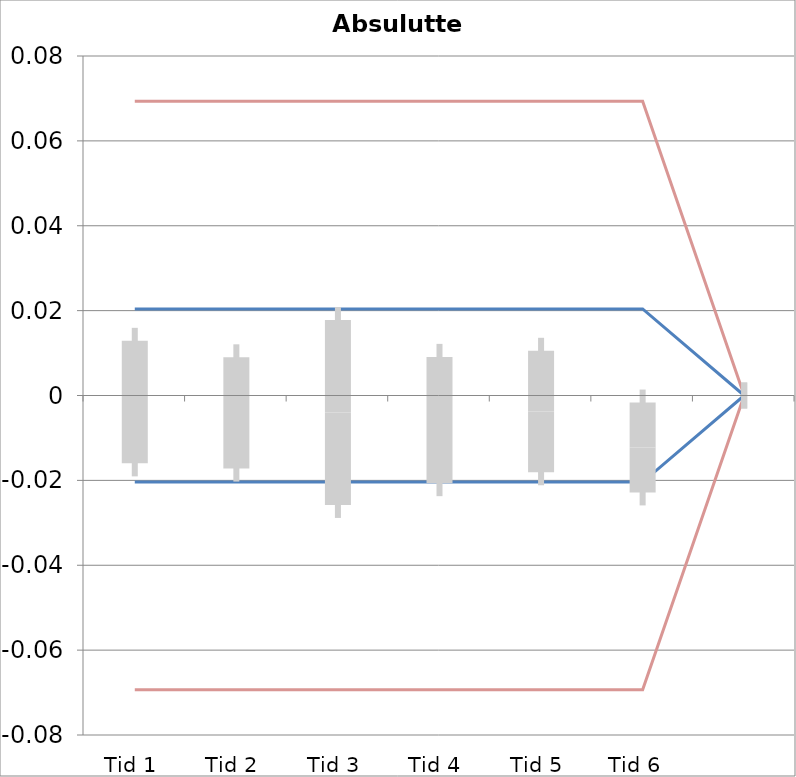
| Category | 1 | 2 | 3 | 4 | 5 | 6 | 7 | 8 | 9 | 10 | 11 | 12 | 13 | 14 | 15 | 16 | 17 | 18 | 19 | 20 | TEa | B | -B | -TEa | M |
|---|---|---|---|---|---|---|---|---|---|---|---|---|---|---|---|---|---|---|---|---|---|---|---|---|---|
| Tid 1 | 0.012 | -0.029 | -0.031 | 0.012 | -0.014 | 0.014 | 0.008 | 0.017 | -0.003 | 0 | 0 | 0 | 0 | 0 | 0 | 0 | 0 | 0 | 0 | 0 | 0.069 | 0.02 | -0.02 | -0.069 | -0.002 |
| Tid 2 | -0.004 | 0.005 | -0.045 | 0.008 | 0.004 | -0.008 | 0.01 | 0.005 | -0.012 | 0 | 0 | 0 | 0 | 0 | 0 | 0 | 0 | 0 | 0 | 0 | 0.069 | 0.02 | -0.02 | -0.069 | -0.004 |
| Tid 3 | 0.005 | 0.036 | -0.033 | 0 | 0.008 | 0.006 | -0.038 | 0.012 | -0.028 | 0 | 0 | 0 | 0 | 0 | 0 | 0 | 0 | 0 | 0 | 0 | 0.069 | 0.02 | -0.02 | -0.069 | -0.004 |
| Tid 4 | 0.006 | 0.006 | -0.021 | -0.004 | -0.003 | -0.018 | -0.016 | 0.032 | -0.034 | 0 | 0 | 0 | 0 | 0 | 0 | 0 | 0 | 0 | 0 | 0 | 0.069 | 0.02 | -0.02 | -0.069 | -0.006 |
| Tid 5 | -0.006 | 0.009 | -0.02 | 0.012 | -0.006 | 0.004 | 0.027 | -0.028 | -0.026 | 0 | 0 | 0 | 0 | 0 | 0 | 0 | 0 | 0 | 0 | 0 | 0.069 | 0.02 | -0.02 | -0.069 | -0.004 |
| Tid 6  | 0 | 0 | 0 | 0 | 0 | -0.003 | -0.012 | -0.016 | -0.018 | 0 | 0 | 0 | 0 | 0 | 0 | 0 | 0 | 0 | 0 | 0 | 0.069 | 0.02 | -0.02 | -0.069 | -0.012 |